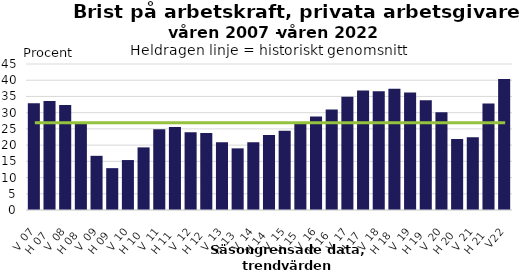
| Category | Series 0 |
|---|---|
| V 07 | 32.9 |
| H 07 | 33.6 |
| V 08 | 32.4 |
| H 08 | 26.6 |
| V 09 | 16.7 |
| H 09 | 12.9 |
| V 10 | 15.4 |
| H 10 | 19.3 |
| V 11 | 24.9 |
| H 11 | 25.6 |
| V 12 | 24 |
| H 12 | 23.7 |
| V 13 | 20.9 |
| H 13 | 19 |
| V 14 | 20.9 |
| H 14 | 23.1 |
| V 15 | 24.4 |
| H 15 | 27 |
| V 16 | 28.8 |
| H 16 | 31 |
| V 17 | 34.9 |
| H 17 | 36.8 |
| V 18 | 36.6 |
| H 18 | 37.4 |
| V 19 | 36.2 |
| H 19 | 33.8 |
| V 20 | 30.1 |
| H 20 | 21.9 |
| V 21 | 22.4 |
| H 21 | 32.8 |
| V22 | 40.4 |